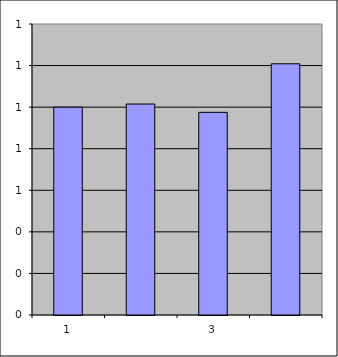
| Category | Series 0 |
|---|---|
| 0 | 1 |
| 1 | 1.015 |
| 2 | 0.975 |
| 3 | 1.209 |